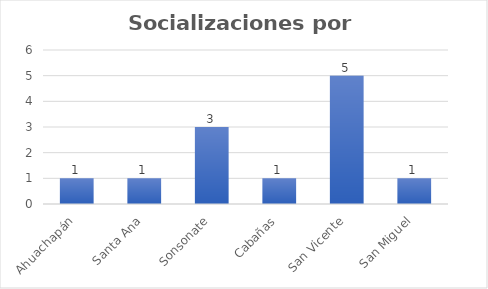
| Category | Socializaciones |
|---|---|
| Ahuachapán | 1 |
| Santa Ana | 1 |
| Sonsonate | 3 |
| Cabañas | 1 |
| San Vicente | 5 |
| San Miguel | 1 |